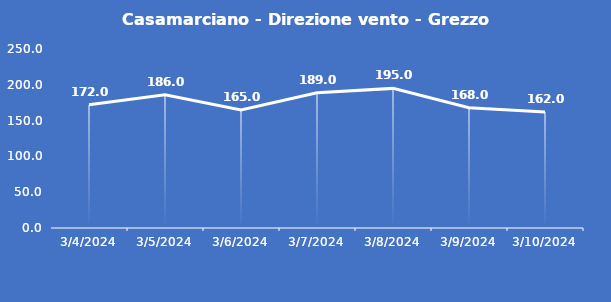
| Category | Casamarciano - Direzione vento - Grezzo (°N) |
|---|---|
| 3/4/24 | 172 |
| 3/5/24 | 186 |
| 3/6/24 | 165 |
| 3/7/24 | 189 |
| 3/8/24 | 195 |
| 3/9/24 | 168 |
| 3/10/24 | 162 |